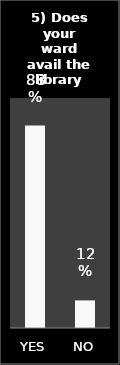
| Category | Series 0 |
|---|---|
| YES | 0.88 |
| NO | 0.12 |